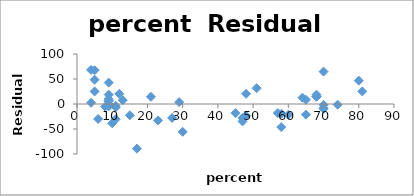
| Category | Series 0 |
|---|---|
| 8.0 | -5.287 |
| 47.0 | -27.71 |
| 27.0 | -27.822 |
| 6.0 | -29.937 |
| 45.0 | -18.301 |
| 29.0 | 3.713 |
| 81.0 | 25.153 |
| 68.0 | 14.484 |
| 48.0 | -23.624 |
| 65.0 | -21.33 |
| 57.0 | -18.107 |
| 15.0 | -22.605 |
| 13.0 | 7.591 |
| 58.0 | -19.626 |
| 5.0 | 48.541 |
| 9.0 | 9.929 |
| 11.0 | -30.316 |
| 9.0 | -0.277 |
| 68.0 | 18.626 |
| 64.0 | 12.641 |
| 80.0 | 46.705 |
| 11.0 | -6.535 |
| 9.0 | 42.756 |
| 4.0 | 2.493 |
| 9.0 | 5.624 |
| 21.0 | 14.432 |
| 9.0 | 6.666 |
| 30.0 | -55.658 |
| 70.0 | 64.79 |
| 70.0 | -9.575 |
| 11.0 | -3.781 |
| 74.0 | -1.319 |
| 60.0 | -21.537 |
| 5.0 | 67.453 |
| 23.0 | -32.813 |
| 9.0 | -4.675 |
| 51.0 | 31.597 |
| 70.0 | -8.24 |
| 70.0 | -1.724 |
| 58.0 | -46.123 |
| 5.0 | 25.127 |
| 12.0 | 20.459 |
| 47.0 | -34.827 |
| 4.0 | 68.262 |
| 68.0 | 14.861 |
| 65.0 | 8.454 |
| 48.0 | 20.385 |
| 17.0 | -89.244 |
| 9.0 | 18.743 |
| 10.0 | -38.491 |